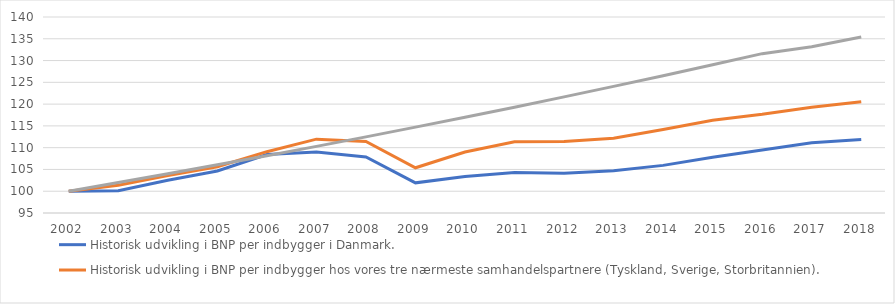
| Category | Historisk udvikling i BNP per indbygger i Danmark. | Historisk udvikling i BNP per indbygger hos vores tre nærmeste samhandelspartnere (Tyskland, Sverige, Storbritannien). | Hvordan BNP per indbygger i Danmark ville have udviklet sig hvis stigningstakten havde fortsat som i perioden 1971-2001 (1,98 per år). |
|---|---|---|---|
| 2002.0 | 100 | 100 | 100 |
| 2003.0 | 100.106 | 101.382 | 101.98 |
| 2004.0 | 102.507 | 103.597 | 103.999 |
| 2005.0 | 104.641 | 105.612 | 106.058 |
| 2006.0 | 108.413 | 109.079 | 108.158 |
| 2007.0 | 109.002 | 111.954 | 110.3 |
| 2008.0 | 107.877 | 111.406 | 112.484 |
| 2009.0 | 101.922 | 105.38 | 114.711 |
| 2010.0 | 103.388 | 108.997 | 116.982 |
| 2011.0 | 104.282 | 111.367 | 119.299 |
| 2012.0 | 104.148 | 111.424 | 121.661 |
| 2013.0 | 104.707 | 112.166 | 124.07 |
| 2014.0 | 105.934 | 114.194 | 126.526 |
| 2015.0 | 107.794 | 116.295 | 129.031 |
| 2016.0 | 109.459 | 117.653 | 131.586 |
| 2017.0 | 111.131 | 119.272 | 133.154 |
| 2018.0 | 111.853 | 120.536 | 135.408 |